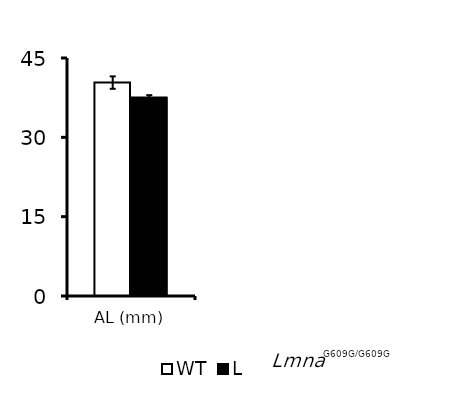
| Category | WT | Lmna |
|---|---|---|
| AL (mm) | 40.348 | 37.544 |